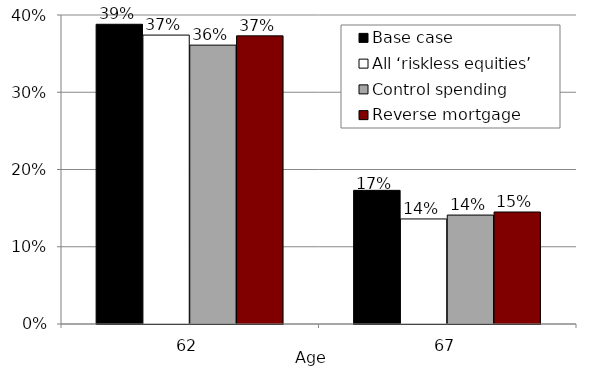
| Category | Base case | All ‘riskless equities’ | Control spending | Reverse mortgage |
|---|---|---|---|---|
| 62.0 | 0.388 | 0.374 | 0.361 | 0.373 |
| 67.0 | 0.173 | 0.136 | 0.141 | 0.145 |